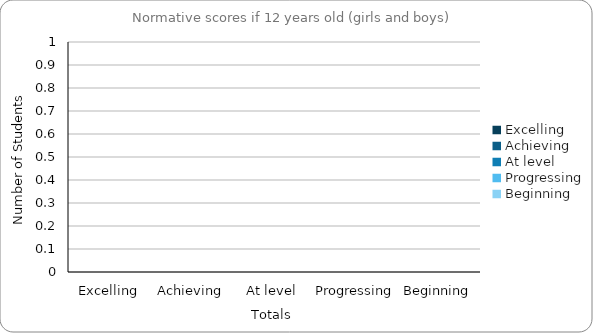
| Category | If 12 Years Old |
|---|---|
| Excelling | 0 |
| Achieving | 0 |
| At level | 0 |
| Progressing | 0 |
| Beginning | 0 |